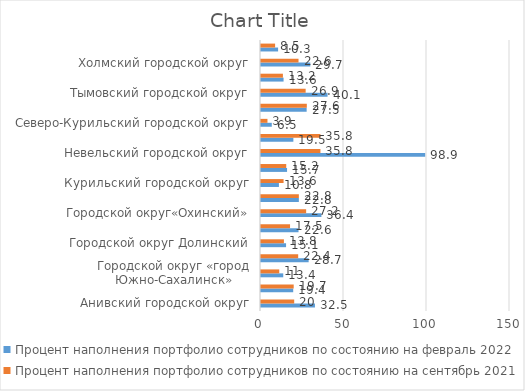
| Category | Процент наполнения портфолио сотрудников по состоянию на февраль 2022 | Процент наполнения портфолио сотрудников по состоянию на сентябрь 2021 |
|---|---|---|
| Анивский городской округ | 32.5 | 20 |
| Городской округ "Александровск-Сахалинский район" | 19.4 | 19.7 |
| Городской округ «город Южно-Сахалинск» | 13.4 | 11 |
| Городской округ «Смирныховский» | 28.7 | 22.4 |
| Городской округ Долинский | 15.1 | 13.8 |
| Городской округ Ногликский | 22.6 | 17.5 |
| Городской округ«Охинский» | 36.4 | 27.2 |
| Корсаковский городской округ | 22.8 | 22.8 |
| Курильский городской округ | 10.8 | 13.6 |
| Макаровский городской округ | 15.7 | 15.2 |
| Невельский городской округ | 98.9 | 35.8 |
| Поронайский городской округ | 19.5 | 35.8 |
| Северо-Курильский городской округ | 6.5 | 3.9 |
| Томаринский городской округ | 27.5 | 27.6 |
| Тымовский городской округ | 40.1 | 26.9 |
| Углегорский городской округ | 13.6 | 13.2 |
| Холмский городской округ | 29.7 | 22.6 |
| Южно-Курильский городской округ | 10.3 | 8.5 |